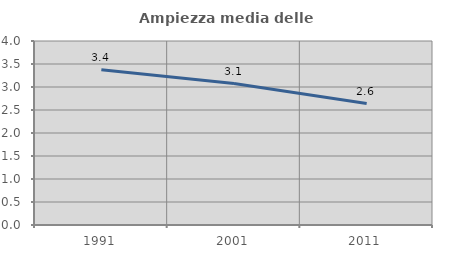
| Category | Ampiezza media delle famiglie |
|---|---|
| 1991.0 | 3.374 |
| 2001.0 | 3.074 |
| 2011.0 | 2.639 |